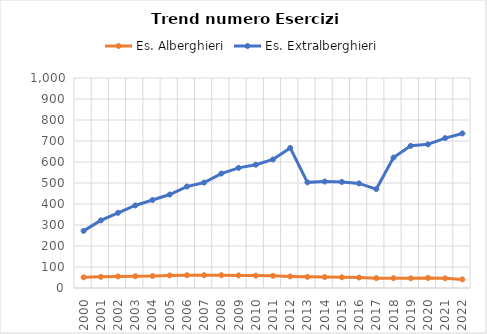
| Category | Es. Alberghieri | Es. Extralberghieri |
|---|---|---|
| 2000.0 | 51 | 272 |
| 2001.0 | 53 | 322 |
| 2002.0 | 55 | 358 |
| 2003.0 | 56 | 393 |
| 2004.0 | 57 | 419 |
| 2005.0 | 60 | 445 |
| 2006.0 | 61 | 483 |
| 2007.0 | 61 | 502 |
| 2008.0 | 61 | 545 |
| 2009.0 | 60 | 572 |
| 2010.0 | 59 | 587 |
| 2011.0 | 58 | 612 |
| 2012.0 | 55 | 667 |
| 2013.0 | 53 | 503 |
| 2014.0 | 52 | 507 |
| 2015.0 | 51 | 505 |
| 2016.0 | 50 | 498 |
| 2017.0 | 47 | 471 |
| 2018.0 | 47 | 621 |
| 2019.0 | 46 | 677 |
| 2020.0 | 48 | 684 |
| 2021.0 | 46 | 714 |
| 2022.0 | 41 | 736 |